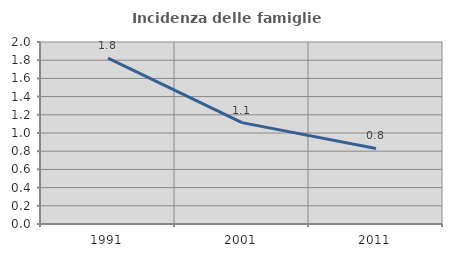
| Category | Incidenza delle famiglie numerose |
|---|---|
| 1991.0 | 1.824 |
| 2001.0 | 1.114 |
| 2011.0 | 0.83 |